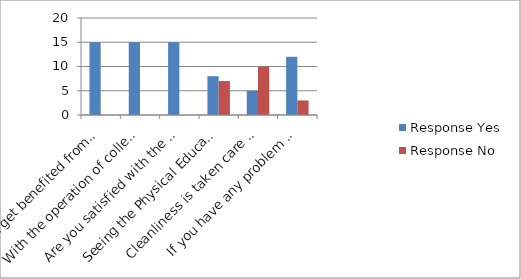
| Category | Response |
|---|---|
| Do you get benefited from college operations here? | 0 |
| With the operation of colleges, there is a huge appreciation for the Education of children. | 0 |
| Are you satisfied with the work done by the college for the Society? | 0 |
| Seeing the Physical Education courses run by the college,  will the Children around you the trend towards sports has increased | 7 |
| Cleanliness is taken care of in and around the campus by the College.  | 10 |
| If you have any problem with any program organized by the College from time to time. | 3 |